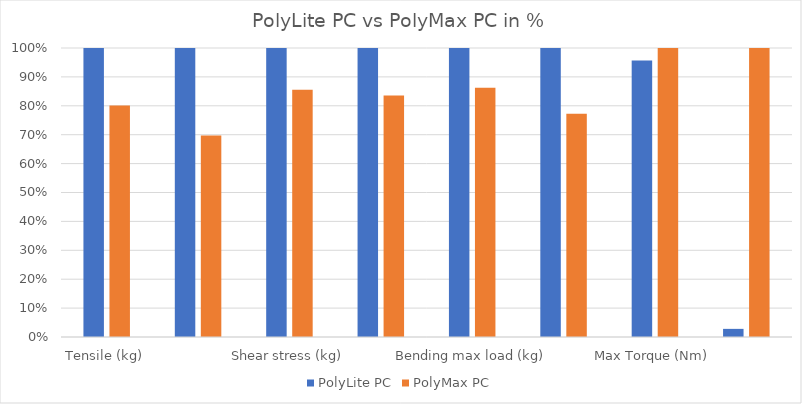
| Category | PolyLite PC | PolyMax PC |
|---|---|---|
| Tensile (kg) | 1 | 0.801 |
| Layer adhesion (kg) | 1 | 0.697 |
| Shear stress (kg) | 1 | 0.855 |
| Bending 2mm deform (kg) | 1 | 0.835 |
| Bending max load (kg) | 1 | 0.862 |
| Torque 90° (Nm) | 1 | 0.773 |
| Max Torque (Nm) | 0.957 | 1 |
| IZOD impact test kJ/m2 | 0.028 | 1 |